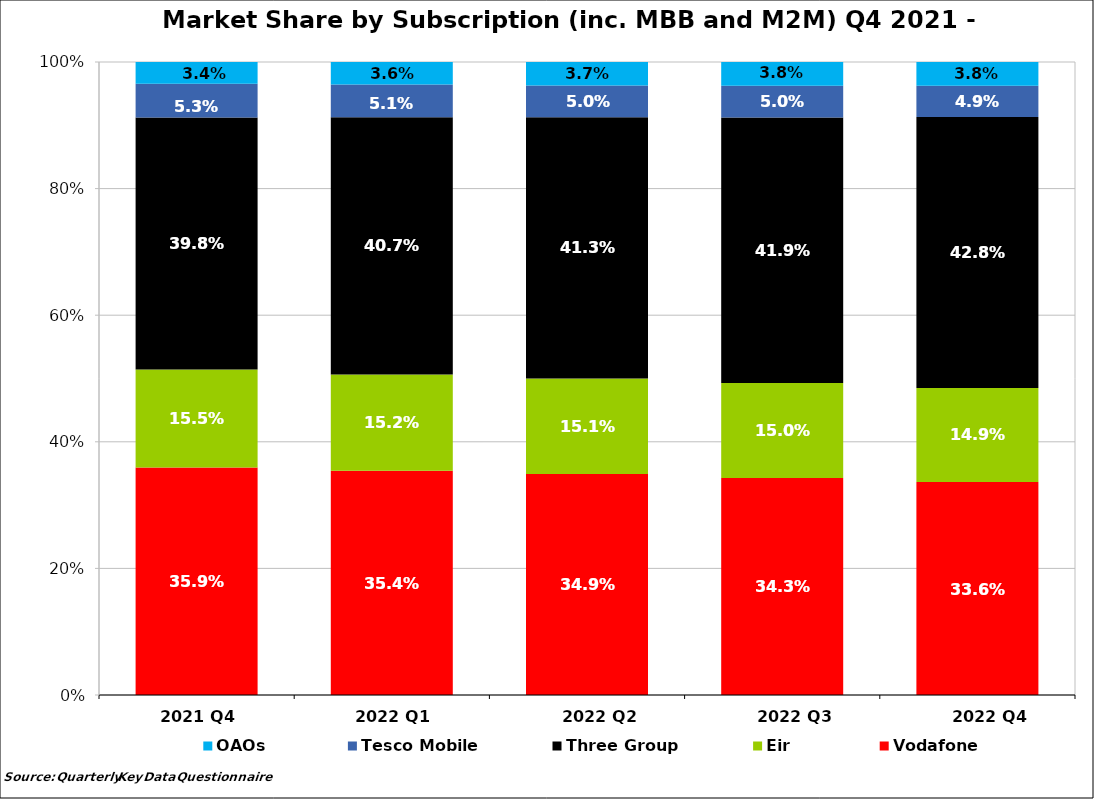
| Category | Vodafone | Eir  | Three Group | Tesco Mobile | OAOs |
|---|---|---|---|---|---|
| 2021 Q4  | 0.359 | 0.155 | 0.398 | 0.053 | 0.034 |
| 2022 Q1  | 0.354 | 0.152 | 0.407 | 0.051 | 0.036 |
| 2022 Q2 | 0.349 | 0.151 | 0.413 | 0.05 | 0.037 |
| 2022 Q3 | 0.343 | 0.15 | 0.419 | 0.05 | 0.038 |
| 2022 Q4 | 0.336 | 0.149 | 0.428 | 0.049 | 0.038 |